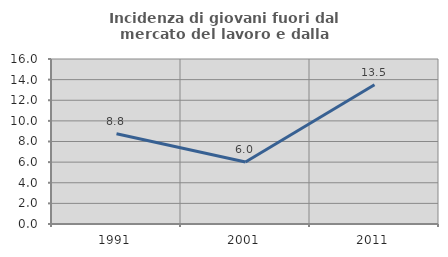
| Category | Incidenza di giovani fuori dal mercato del lavoro e dalla formazione  |
|---|---|
| 1991.0 | 8.753 |
| 2001.0 | 6.005 |
| 2011.0 | 13.496 |